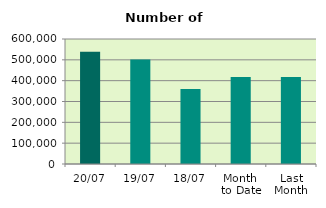
| Category | Series 0 |
|---|---|
| 20/07 | 538434 |
| 19/07 | 501534 |
| 18/07 | 359420 |
| Month 
to Date | 417269.286 |
| Last
Month | 418146.182 |